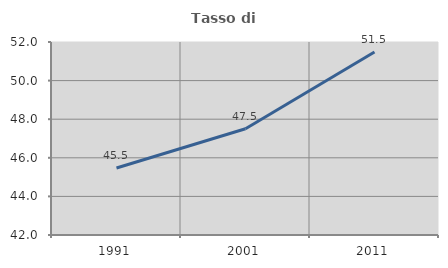
| Category | Tasso di occupazione   |
|---|---|
| 1991.0 | 45.473 |
| 2001.0 | 47.505 |
| 2011.0 | 51.482 |